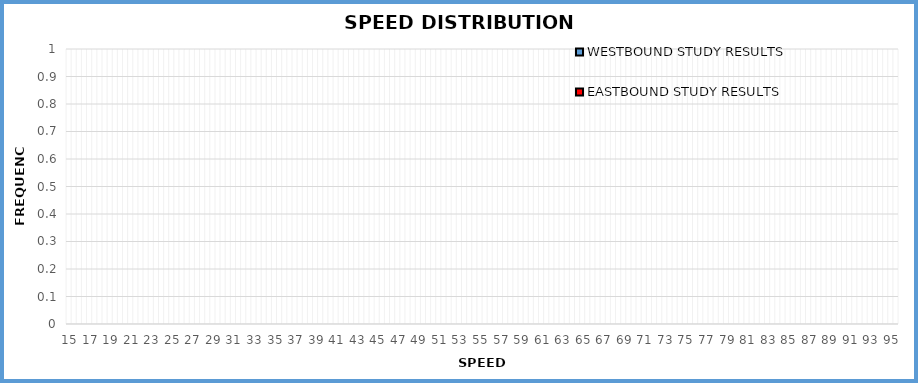
| Category | EASTBOUND STUDY RESULTS | WESTBOUND STUDY RESULTS |
|---|---|---|
| 15.0 | 0 | 0 |
| 16.0 | 0 | 0 |
| 17.0 | 0 | 0 |
| 18.0 | 0 | 0 |
| 19.0 | 0 | 0 |
| 20.0 | 0 | 0 |
| 21.0 | 0 | 0 |
| 22.0 | 0 | 0 |
| 23.0 | 0 | 0 |
| 24.0 | 0 | 0 |
| 25.0 | 0 | 0 |
| 26.0 | 0 | 0 |
| 27.0 | 0 | 0 |
| 28.0 | 0 | 0 |
| 29.0 | 0 | 0 |
| 30.0 | 0 | 0 |
| 31.0 | 0 | 0 |
| 32.0 | 0 | 0 |
| 33.0 | 0 | 0 |
| 34.0 | 0 | 0 |
| 35.0 | 0 | 0 |
| 36.0 | 0 | 0 |
| 37.0 | 0 | 0 |
| 38.0 | 0 | 0 |
| 39.0 | 0 | 0 |
| 40.0 | 0 | 0 |
| 41.0 | 0 | 0 |
| 42.0 | 0 | 0 |
| 43.0 | 0 | 0 |
| 44.0 | 0 | 0 |
| 45.0 | 0 | 0 |
| 46.0 | 0 | 0 |
| 47.0 | 0 | 0 |
| 48.0 | 0 | 0 |
| 49.0 | 0 | 0 |
| 50.0 | 0 | 0 |
| 51.0 | 0 | 0 |
| 52.0 | 0 | 0 |
| 53.0 | 0 | 0 |
| 54.0 | 0 | 0 |
| 55.0 | 0 | 0 |
| 56.0 | 0 | 0 |
| 57.0 | 0 | 0 |
| 58.0 | 0 | 0 |
| 59.0 | 0 | 0 |
| 60.0 | 0 | 0 |
| 61.0 | 0 | 0 |
| 62.0 | 0 | 0 |
| 63.0 | 0 | 0 |
| 64.0 | 0 | 0 |
| 65.0 | 0 | 0 |
| 66.0 | 0 | 0 |
| 67.0 | 0 | 0 |
| 68.0 | 0 | 0 |
| 69.0 | 0 | 0 |
| 70.0 | 0 | 0 |
| 71.0 | 0 | 0 |
| 72.0 | 0 | 0 |
| 73.0 | 0 | 0 |
| 74.0 | 0 | 0 |
| 75.0 | 0 | 0 |
| 76.0 | 0 | 0 |
| 77.0 | 0 | 0 |
| 78.0 | 0 | 0 |
| 79.0 | 0 | 0 |
| 80.0 | 0 | 0 |
| 81.0 | 0 | 0 |
| 82.0 | 0 | 0 |
| 83.0 | 0 | 0 |
| 84.0 | 0 | 0 |
| 85.0 | 0 | 0 |
| 86.0 | 0 | 0 |
| 87.0 | 0 | 0 |
| 88.0 | 0 | 0 |
| 89.0 | 0 | 0 |
| 90.0 | 0 | 0 |
| 91.0 | 0 | 0 |
| 92.0 | 0 | 0 |
| 93.0 | 0 | 0 |
| 94.0 | 0 | 0 |
| 95.0 | 0 | 0 |